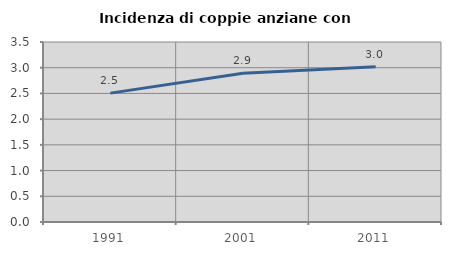
| Category | Incidenza di coppie anziane con figli |
|---|---|
| 1991.0 | 2.506 |
| 2001.0 | 2.893 |
| 2011.0 | 3.021 |